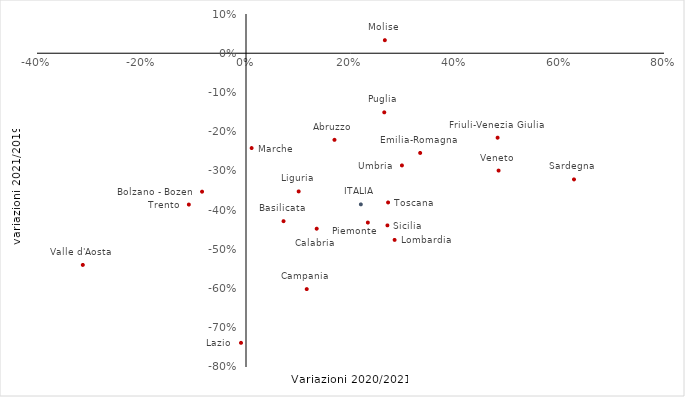
| Category | Var.% 2019-2021 |
|---|---|
| 0.23319870297758066 | -0.432 |
| -0.31232850973186616 | -0.54 |
| 0.2843944847211696 | -0.476 |
| -0.0841036570051377 | -0.353 |
| -0.10937107101345737 | -0.386 |
| 0.48341394115834024 | -0.299 |
| 0.48154683395535447 | -0.215 |
| 0.10082754485937266 | -0.352 |
| 0.333347254587774 | -0.254 |
| 0.271912902856342 | -0.38 |
| 0.29845055556795996 | -0.286 |
| 0.01076614203316949 | -0.242 |
| -0.009556082658842724 | -0.738 |
| 0.16934448745161693 | -0.221 |
| 0.26574737557764216 | 0.033 |
| 0.1162364928924127 | -0.601 |
| 0.264638624786241 | -0.151 |
| 0.07182407561403453 | -0.428 |
| 0.13532009628126812 | -0.447 |
| 0.27066267717089115 | -0.439 |
| 0.6277245510098601 | -0.322 |
| 0.2197761515776039 | -0.385 |